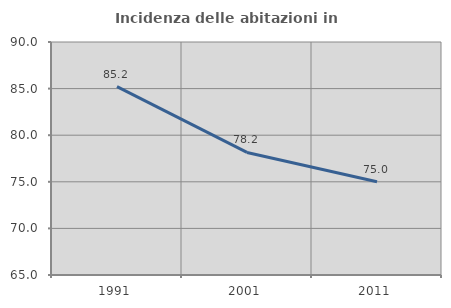
| Category | Incidenza delle abitazioni in proprietà  |
|---|---|
| 1991.0 | 85.217 |
| 2001.0 | 78.151 |
| 2011.0 | 75 |